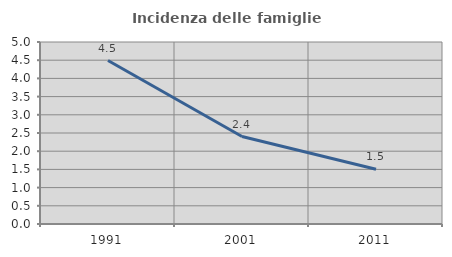
| Category | Incidenza delle famiglie numerose |
|---|---|
| 1991.0 | 4.492 |
| 2001.0 | 2.404 |
| 2011.0 | 1.504 |